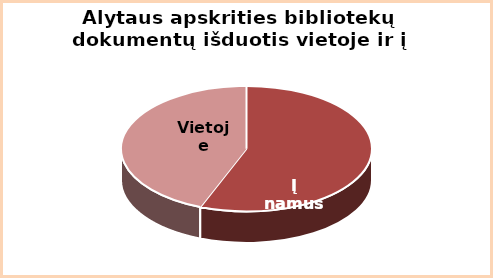
| Category | Series 0 |
|---|---|
|  į namus | 0.56 |
|  vietoje | 0.44 |